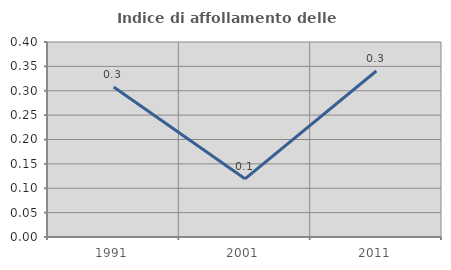
| Category | Indice di affollamento delle abitazioni  |
|---|---|
| 1991.0 | 0.308 |
| 2001.0 | 0.119 |
| 2011.0 | 0.34 |